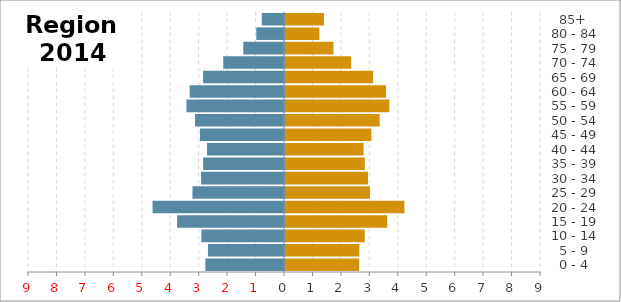
| Category | Female | Male |
|---|---|---|
|   0 - 4 | 2.609 | -2.764 |
|   5 - 9 | 2.616 | -2.673 |
| 10 - 14 | 2.805 | -2.905 |
| 15 - 19 | 3.593 | -3.759 |
| 20 - 24 | 4.199 | -4.622 |
| 25 - 29 | 2.986 | -3.219 |
| 30 - 34 | 2.918 | -2.915 |
| 35 - 39 | 2.806 | -2.843 |
| 40 - 44 | 2.763 | -2.707 |
| 45 - 49 | 3.038 | -2.954 |
| 50 - 54 | 3.328 | -3.13 |
| 55 - 59 | 3.67 | -3.429 |
| 60 - 64 | 3.552 | -3.316 |
| 65 - 69 | 3.099 | -2.844 |
| 70 - 74 | 2.328 | -2.137 |
| 75 - 79 | 1.706 | -1.431 |
| 80 - 84 | 1.209 | -0.975 |
|   85+ | 1.372 | -0.782 |